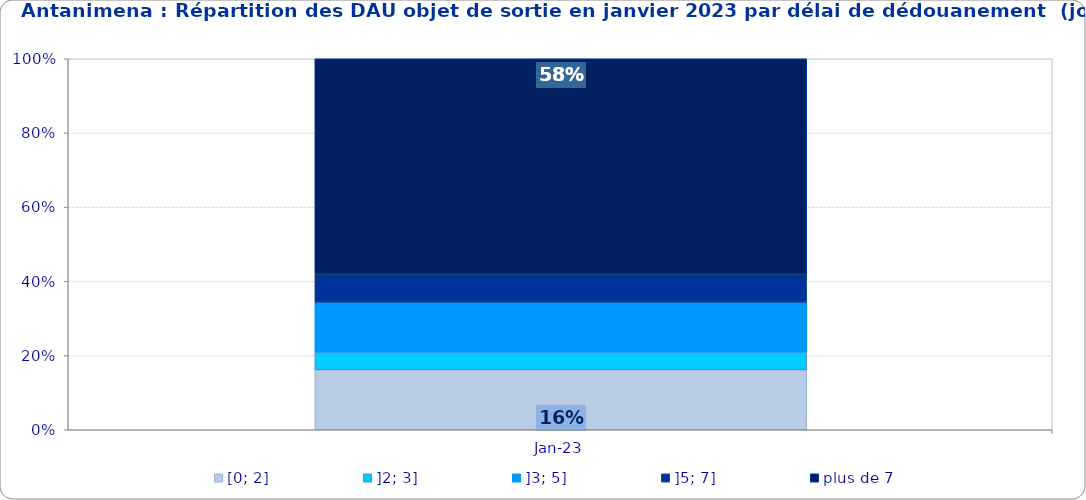
| Category | [0; 2] | ]2; 3] | ]3; 5] | ]5; 7] | plus de 7 |
|---|---|---|---|---|---|
| 2023-01-01 | 0.162 | 0.048 | 0.134 | 0.076 | 0.58 |